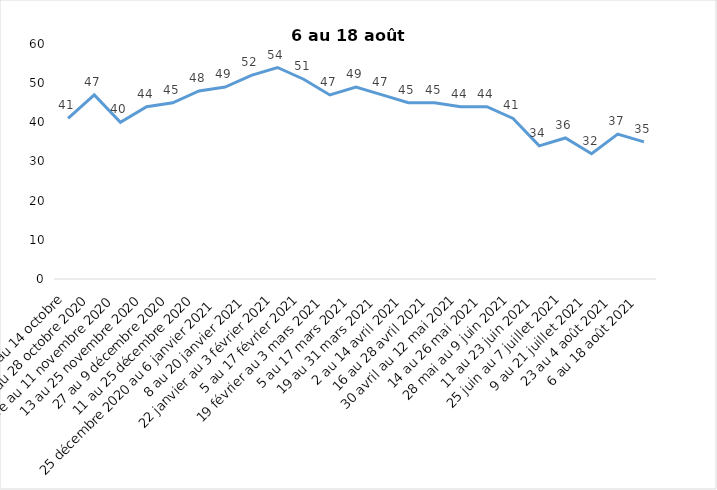
| Category | Toujours aux trois mesures |
|---|---|
| 2 au 14 octobre | 41 |
| 16 au 28 octobre 2020 | 47 |
| 30 octobre au 11 novembre 2020 | 40 |
| 13 au 25 novembre 2020 | 44 |
| 27 au 9 décembre 2020 | 45 |
| 11 au 25 décembre 2020 | 48 |
| 25 décembre 2020 au 6 janvier 2021 | 49 |
| 8 au 20 janvier 2021 | 52 |
| 22 janvier au 3 février 2021 | 54 |
| 5 au 17 février 2021 | 51 |
| 19 février au 3 mars 2021 | 47 |
| 5 au 17 mars 2021 | 49 |
| 19 au 31 mars 2021 | 47 |
| 2 au 14 avril 2021 | 45 |
| 16 au 28 avril 2021 | 45 |
| 30 avril au 12 mai 2021 | 44 |
| 14 au 26 mai 2021 | 44 |
| 28 mai au 9 juin 2021 | 41 |
| 11 au 23 juin 2021 | 34 |
| 25 juin au 7 juillet 2021 | 36 |
| 9 au 21 juillet 2021 | 32 |
| 23 au 4 août 2021 | 37 |
| 6 au 18 août 2021 | 35 |